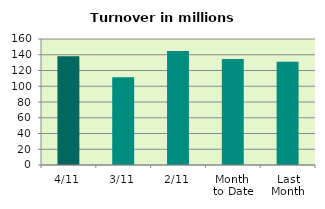
| Category | Series 0 |
|---|---|
| 4/11 | 138.215 |
| 3/11 | 111.532 |
| 2/11 | 144.838 |
| Month 
to Date | 134.574 |
| Last
Month | 131.017 |